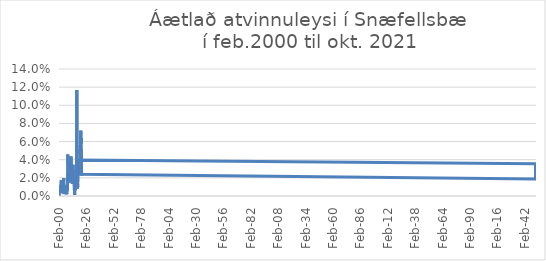
| Category | Áætlað atvinnuleysi |
|---|---|
| 2000-02-01 | 0.003 |
| 2000-03-01 | 0.004 |
| 2000-04-01 | 0 |
| 2000-05-01 | 0.002 |
| 2000-06-01 | 0.004 |
| 2000-07-01 | 0.005 |
| 2000-08-01 | 0.007 |
| 2000-09-01 | 0.006 |
| 2000-10-01 | 0.009 |
| 2000-11-01 | 0.009 |
| 2000-12-01 | 0.009 |
| 2001-01-01 | 0.007 |
| 2001-02-01 | 0.004 |
| 2001-03-01 | 0.005 |
| 2001-04-01 | 0.007 |
| 2001-05-01 | 0.004 |
| 2001-06-01 | 0.004 |
| 2001-07-01 | 0.005 |
| 2001-08-01 | 0.004 |
| 2001-09-01 | 0.003 |
| 2001-10-01 | 0.005 |
| 2001-11-01 | 0.006 |
| 2001-12-01 | 0.009 |
| 2002-01-01 | 0.012 |
| 2002-02-01 | 0.009 |
| 2002-03-01 | 0.013 |
| 2002-04-01 | 0.017 |
| 2002-05-01 | 0.012 |
| 2002-06-01 | 0.011 |
| 2002-07-01 | 0.01 |
| 2002-08-01 | 0.011 |
| 2002-09-01 | 0.011 |
| 2002-10-01 | 0.011 |
| 2002-11-01 | 0.016 |
| 2002-12-01 | 0.012 |
| 2003-01-01 | 0.011 |
| 2003-02-01 | 0.016 |
| 2003-03-01 | 0.016 |
| 2003-04-01 | 0.015 |
| 2003-05-01 | 0.011 |
| 2003-06-01 | 0.011 |
| 2003-07-01 | 0.011 |
| 2003-08-01 | 0.005 |
| 2003-09-01 | 0.004 |
| 2003-10-01 | 0.003 |
| 2003-11-01 | 0.002 |
| 2003-12-01 | 0.007 |
| 2004-01-01 | 0.008 |
| 2004-02-01 | 0.008 |
| 2004-03-01 | 0.01 |
| 2004-04-01 | 0.012 |
| 2004-05-01 | 0.011 |
| 2004-06-01 | 0.01 |
| 2004-07-01 | 0.019 |
| 2004-08-01 | 0.012 |
| 2004-09-01 | 0.008 |
| 2004-10-01 | 0.011 |
| 2004-11-01 | 0.004 |
| 2004-12-01 | 0.004 |
| 2005-01-01 | 0.002 |
| 2005-02-01 | 0.003 |
| 2005-03-01 | 0.002 |
| 2005-04-01 | 0.004 |
| 2005-05-01 | 0.004 |
| 2005-06-01 | 0.005 |
| 2005-07-01 | 0.007 |
| 2005-08-01 | 0.007 |
| 2005-09-01 | 0.005 |
| 2005-10-01 | 0.005 |
| 2005-11-01 | 0.003 |
| 2005-12-01 | 0.004 |
| 2006-01-01 | 0.008 |
| 2006-02-01 | 0.011 |
| 2006-03-01 | 0.01 |
| 2006-04-01 | 0.008 |
| 2006-05-01 | 0.009 |
| 2006-06-01 | 0.007 |
| 2006-07-01 | 0.01 |
| 2006-08-01 | 0.011 |
| 2006-09-01 | 0.009 |
| 2006-10-01 | 0.008 |
| 2006-11-01 | 0.005 |
| 2006-12-01 | 0.006 |
| 2007-01-01 | 0.007 |
| 2007-02-01 | 0.007 |
| 2007-03-01 | 0.007 |
| 2007-04-01 | 0.008 |
| 2007-05-01 | 0.007 |
| 2007-06-01 | 0.002 |
| 2007-07-01 | 0.005 |
| 2007-08-01 | 0.006 |
| 2007-09-01 | 0.01 |
| 2007-10-01 | 0.012 |
| 2007-11-01 | 0.008 |
| 2007-12-01 | 0.005 |
| 2008-01-01 | 0.012 |
| 2008-02-01 | 0.012 |
| 2008-03-01 | 0.012 |
| 2008-04-01 | 0.009 |
| 2008-05-01 | 0.025 |
| 2008-06-01 | 0.044 |
| 2008-07-01 | 0.046 |
| 2008-08-01 | 0.034 |
| 2008-09-01 | 0.018 |
| 2008-10-01 | 0.014 |
| 2008-11-01 | 0.019 |
| 2008-12-01 | 0.02 |
| 2009-01-01 | 0.019 |
| 2009-02-01 | 0.02 |
| 2009-03-01 | 0.025 |
| 2009-04-01 | 0.024 |
| 2009-05-01 | 0.021 |
| 2009-06-01 | 0.02 |
| 2009-07-01 | 0.041 |
| 2009-08-01 | 0.026 |
| 2009-09-01 | 0.017 |
| 2009-10-01 | 0.023 |
| 2009-11-01 | 0.03 |
| 2009-12-01 | 0.026 |
| 2010-01-01 | 0.027 |
| 2010-02-01 | 0.027 |
| 2010-03-01 | 0.026 |
| 2010-04-01 | 0.028 |
| 2010-05-01 | 0.035 |
| 2010-06-01 | 0.036 |
| 2010-07-01 | 0.042 |
| 2010-08-01 | 0.029 |
| 2010-09-01 | 0.023 |
| 2010-10-01 | 0.024 |
| 2010-11-01 | 0.023 |
| 2010-12-01 | 0.023 |
| 2011-01-01 | 0.026 |
| 2011-02-01 | 0.033 |
| 2011-03-01 | 0.035 |
| 2011-04-01 | 0.03 |
| 2011-05-01 | 0.03 |
| 2011-06-01 | 0.039 |
| 2011-07-01 | 0.044 |
| 2011-08-01 | 0.025 |
| 2011-09-01 | 0.018 |
| 2011-10-01 | 0.017 |
| 2011-11-01 | 0.017 |
| 2011-12-01 | 0.015 |
| 2012-01-01 | 0.018 |
| 2012-02-01 | 0.016 |
| 2012-03-01 | 0.021 |
| 2012-04-01 | 0.02 |
| 2012-05-01 | 0.016 |
| 2012-06-01 | 0.03 |
| 2012-07-01 | 0.034 |
| 2012-08-01 | 0.033 |
| 2012-09-01 | 0.018 |
| 2012-10-01 | 0.014 |
| 2012-11-01 | 0.017 |
| 2012-12-01 | 0.016 |
| 2013-01-01 | 0.014 |
| 2013-02-01 | 0.016 |
| 2013-03-01 | 0.02 |
| 2013-04-01 | 0.021 |
| 2013-05-01 | 0.022 |
| 2013-06-01 | 0.034 |
| 2013-07-01 | 0.034 |
| 2013-08-01 | 0.035 |
| 2013-09-01 | 0.018 |
| 2013-10-01 | 0.018 |
| 2013-11-01 | 0.016 |
| 2013-12-01 | 0.015 |
| 2014-01-01 | 0.018 |
| 2014-02-01 | 0.017 |
| 2014-03-01 | 0.017 |
| 2014-04-01 | 0.016 |
| 2014-05-01 | 0.014 |
| 2014-06-01 | 0.018 |
| 2014-07-01 | 0.018 |
| 2014-08-01 | 0.011 |
| 2014-09-01 | 0.011 |
| 2014-10-01 | 0.003 |
| 2014-11-01 | 0.003 |
| 2014-12-01 | 0.001 |
| 2015-01-01 | 0.003 |
| 2015-02-01 | 0.003 |
| 2015-03-01 | 0.005 |
| 2015-04-01 | 0.009 |
| 2015-05-01 | 0.006 |
| 2015-06-01 | 0.017 |
| 2015-07-01 | 0.016 |
| 2015-08-01 | 0.015 |
| 2015-09-01 | 0.015 |
| 2015-10-01 | 0.009 |
| 2015-11-01 | 0.012 |
| 2015-12-01 | 0.016 |
| 2016-01-01 | 0.016 |
| 2016-02-01 | 0.015 |
| 2016-03-01 | 0.012 |
| 2016-04-01 | 0.011 |
| 2016-05-01 | 0.009 |
| 2016-06-01 | 0.016 |
| 2016-07-01 | 0.016 |
| 2016-08-01 | 0.024 |
| 2016-09-01 | 0.022 |
| 2016-10-01 | 0.021 |
| 2016-11-01 | 0.019 |
| 2016-12-01 | 0.04 |
| 2017-01-01 | 0.117 |
| 2017-02-01 | 0.029 |
| 2017-03-01 | 0.025 |
| 2017-04-01 | 0.024 |
| 2017-05-01 | 0.023 |
| 2017-06-01 | 0.033 |
| 2017-07-01 | 0.031 |
| 2017-08-01 | 0.031 |
| 2017-09-01 | 0.017 |
| 2017-10-01 | 0.008 |
| 2017-11-01 | 0.014 |
| 2017-12-01 | 0.015 |
| 2018-01-01 | 0.016 |
| 2018-02-01 | 0.018 |
| 2018-03-01 | 0.029 |
| 2018-04-01 | 0.032 |
| 2018-05-01 | 0.027 |
| 2018-06-01 | 0.032 |
| 2018-07-01 | 0.04 |
| 201808.0 | 0.036 |
| 201809.0 | 0.025 |
| 201810.0 | 0.022 |
| 201811.0 | 0.019 |
| 201812.0 | 0.019 |
| 201901.0 | 0.023 |
| 201902.0 | 0.022 |
| 201903.0 | 0.022 |
| 201904.0 | 0.025 |
| 201905.0 | 0.032 |
| 201906.0 | 0.033 |
| 201907.0 | 0.027 |
| 201908.0 | 0.034 |
| 201909.0 | 0.024 |
| 201910.0 | 0.019 |
| 201911.0 | 0.02 |
| 2019-12-01 | 0.024 |
| 2020-01-01 | 0.028 |
| 2020-02-01 | 0.024 |
| 2020-03-01 | 0.049 |
| 2020-04-01 | 0.051 |
| 2020-05-01 | 0.046 |
| 2020-06-01 | 0.066 |
| 2020-07-01 | 0.059 |
| 2020-08-01 | 0.063 |
| 2020-09-01 | 0.058 |
| 2020-10-01 | 0.072 |
| 2020-11-01 | 0.062 |
| 2020-12-01 | 0.06 |
| 2021-01-01 | 0.063 |
| 2021-02-01 | 0.059 |
| 2021-03-01 | 0.064 |
| 2021-04-01 | 0.058 |
| 2021-05-01 | 0.059 |
| 2021-06-01 | 0.044 |
| 2021-07-01 | 0.028 |
| 2021-08-01 | 0.027 |
| 2021-09-01 | 0.022 |
| 2021-10-01 | 0.021 |